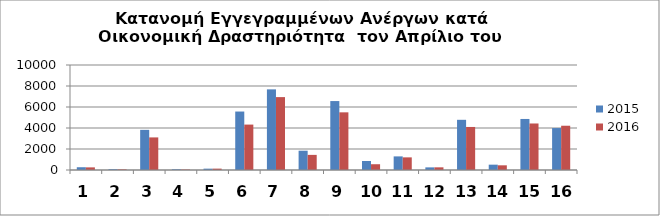
| Category | 2015 | 2016 |
|---|---|---|
| 0 | 264 | 250 |
| 1 | 74 | 60 |
| 2 | 3823 | 3104 |
| 3 | 68 | 44 |
| 4 | 128 | 131 |
| 5 | 5568 | 4325 |
| 6 | 7679 | 6942 |
| 7 | 1836 | 1440 |
| 8 | 6566 | 5492 |
| 9 | 855 | 550 |
| 10 | 1296 | 1203 |
| 11 | 250 | 254 |
| 12 | 4780 | 4099 |
| 13 | 508 | 446 |
| 14 | 4861 | 4430 |
| 15 | 3995 | 4216 |